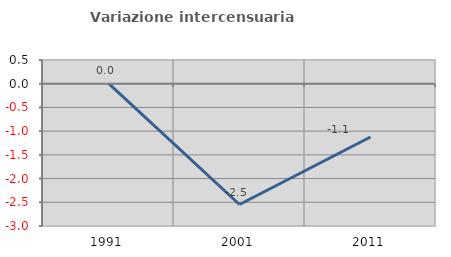
| Category | Variazione intercensuaria annua |
|---|---|
| 1991.0 | 0.009 |
| 2001.0 | -2.547 |
| 2011.0 | -1.123 |